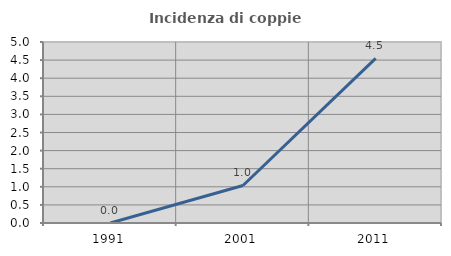
| Category | Incidenza di coppie miste |
|---|---|
| 1991.0 | 0 |
| 2001.0 | 1.036 |
| 2011.0 | 4.545 |